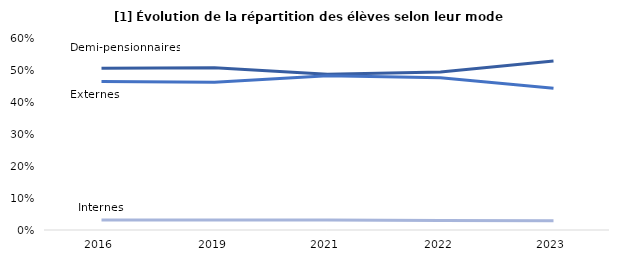
| Category | Demi-pensionnaires | Externes | Internes |
|---|---|---|---|
| 2016 | 0.505 | 0.464 | 0.031 |
| 2019 | 0.507 | 0.462 | 0.031 |
| 2021 | 0.487 | 0.482 | 0.031 |
| 2022 | 0.494 | 0.476 | 0.03 |
| 2023 | 0.528 | 0.443 | 0.029 |